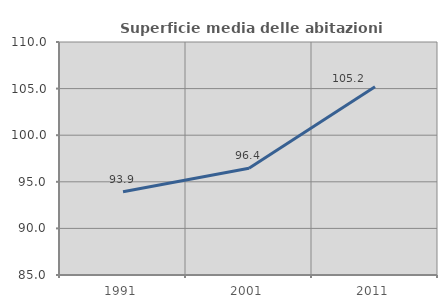
| Category | Superficie media delle abitazioni occupate |
|---|---|
| 1991.0 | 93.94 |
| 2001.0 | 96.448 |
| 2011.0 | 105.192 |